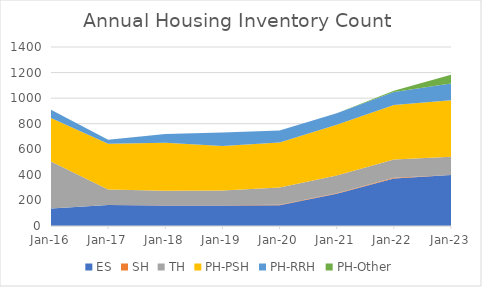
| Category | ES | SH | TH | PH-PSH | PH-RRH | PH-Other |
|---|---|---|---|---|---|---|
| 2016-01-27 | 136 | 0 | 369 | 340 | 64 | 0 |
| 2017-01-25 | 164 | 0 | 121 | 358 | 32 | 0 |
| 2018-01-25 | 161 | 2 | 113 | 375 | 68 | 0 |
| 2019-01-23 | 161 | 2 | 115 | 347 | 107 | 0 |
| 2020-01-22 | 163 | 3 | 136 | 352 | 92 | 0 |
| 2021-01-27 | 252 | 5 | 138 | 397 | 89 | 0 |
| 2022-01-26 | 372 | 5 | 144 | 426 | 101 | 10 |
| 2023-01-25 | 398 | 0 | 144 | 442 | 130 | 68 |